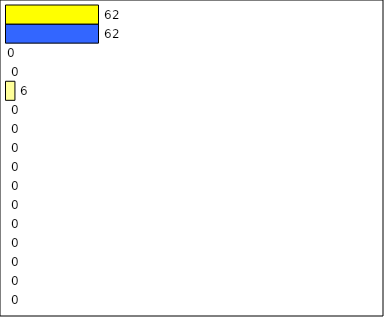
| Category | -2 | -1 | 0 | 1 | 2 | 3 | 4 | 5 | 6 | 7 | 8 | 9 | 10 | 11 | 12 | Perfect Round |
|---|---|---|---|---|---|---|---|---|---|---|---|---|---|---|---|---|
| 0 | 0 | 0 | 0 | 0 | 0 | 0 | 0 | 0 | 0 | 0 | 0 | 6 | 0 | 0 | 62 | 62 |